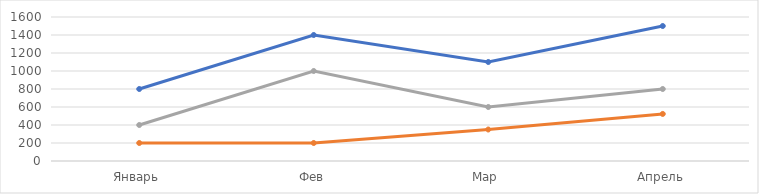
| Category | Арина | Дмитрий | Артем |
|---|---|---|---|
| Январь | 800 | 200 | 400 |
| Фев | 1400 | 200 | 1000 |
| Мар | 1100 | 350 | 600 |
| Апрель | 1500 | 523 | 800 |